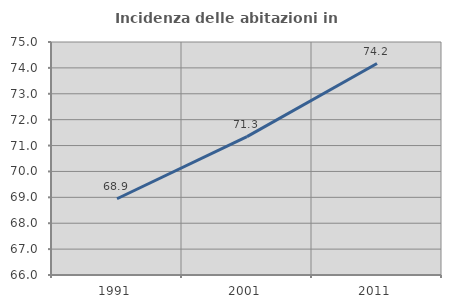
| Category | Incidenza delle abitazioni in proprietà  |
|---|---|
| 1991.0 | 68.945 |
| 2001.0 | 71.343 |
| 2011.0 | 74.168 |